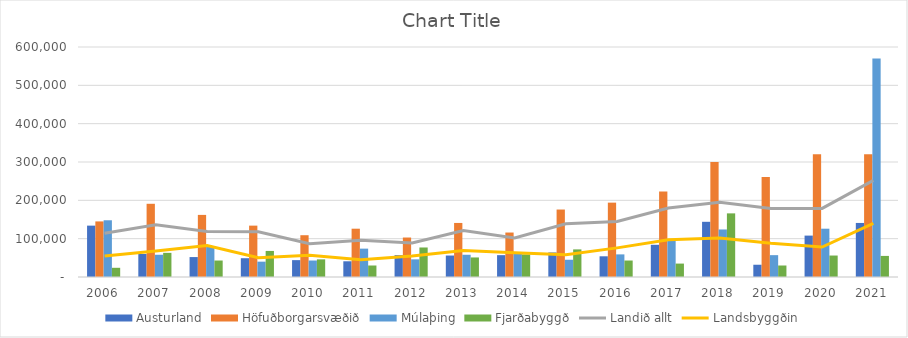
| Category | Austurland | Höfuðborgarsvæðið | Múlaþing | Fjarðabyggð |
|---|---|---|---|---|
| 2006.0 | 134000 | 145000 | 148000 | 24000 |
| 2007.0 | 60000 | 191000 | 58000 | 63000 |
| 2008.0 | 52000 | 162000 | 80000 | 43000 |
| 2009.0 | 49000 | 134000 | 40000 | 68000 |
| 2010.0 | 44000 | 109000 | 43000 | 46000 |
| 2011.0 | 41000 | 126000 | 74000 | 30000 |
| 2012.0 | 57000 | 103000 | 46000 | 77000 |
| 2013.0 | 56000 | 141000 | 58000 | 51000 |
| 2014.0 | 57000 | 116000 | 64000 | 59000 |
| 2015.0 | 64000 | 176000 | 45000 | 72000 |
| 2016.0 | 54000 | 194000 | 59000 | 43000 |
| 2017.0 | 84000 | 223000 | 97000 | 35000 |
| 2018.0 | 144000 | 300000 | 124000 | 166000 |
| 2019.0 | 32000 | 261000 | 57000 | 30000 |
| 2020.0 | 108000 | 320000 | 126000 | 56000 |
| 2021.0 | 141000 | 320000 | 570000 | 55000 |